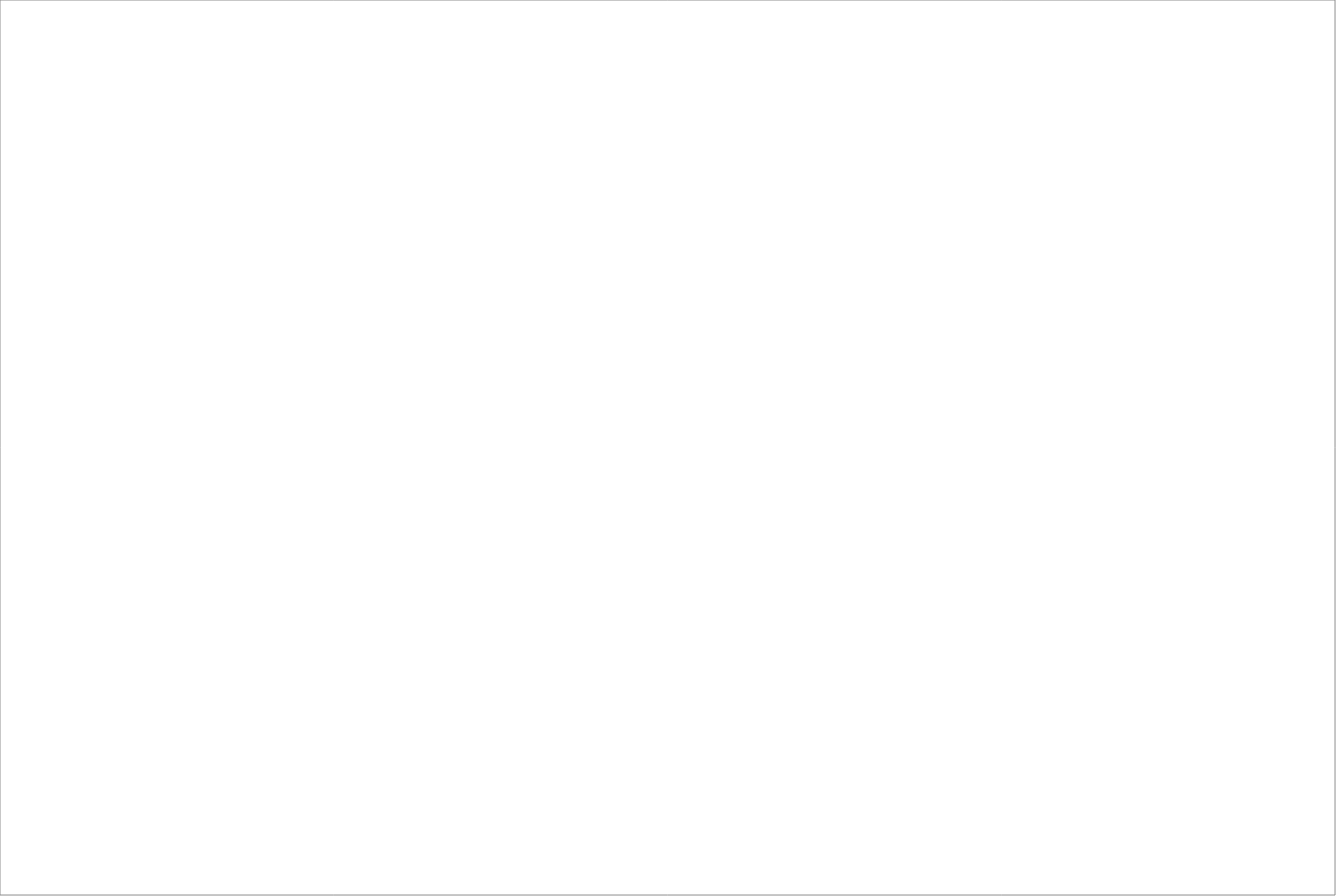
| Category | Total |
|---|---|
| Randstad AB | 77.5 |
| Poolia Sverige Aktiebolag | 65 |
| Academic Work Sweden AB | 62.5 |
| Experis AB | 62.5 |
| StudentConsulting Sweden AB | 42.5 |